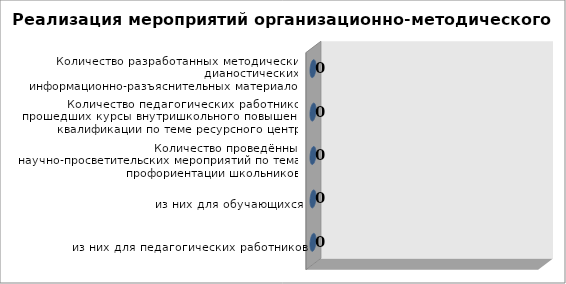
| Category | Series 0 |
|---|---|
| из них для педагогических работников | 0 |
| из них для обучающихся | 0 |
| Количество проведённых научно-просветительских мероприятий по темам профориентации школьников  | 0 |
| Количество педагогических работников, прошедших курсы внутришкольного повышения квалификации по теме ресурсного центра | 0 |
| Количество разработанных методических, дианостических, информационно-разъяснительных материалов  | 0 |